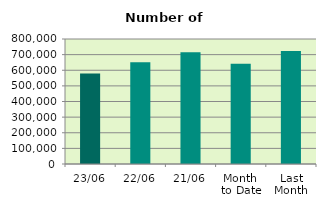
| Category | Series 0 |
|---|---|
| 23/06 | 578432 |
| 22/06 | 651908 |
| 21/06 | 715674 |
| Month 
to Date | 641833.882 |
| Last
Month | 723791.905 |